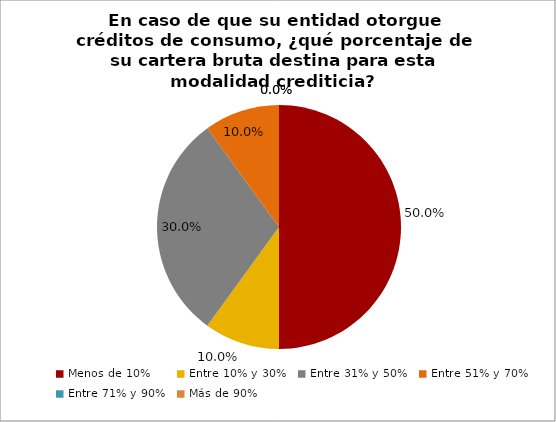
| Category | Series 0 |
|---|---|
| Menos de 10% | 0.5 |
| Entre 10% y 30% | 0.1 |
| Entre 31% y 50% | 0.3 |
| Entre 51% y 70% | 0.1 |
| Entre 71% y 90% | 0 |
| Más de 90% | 0 |